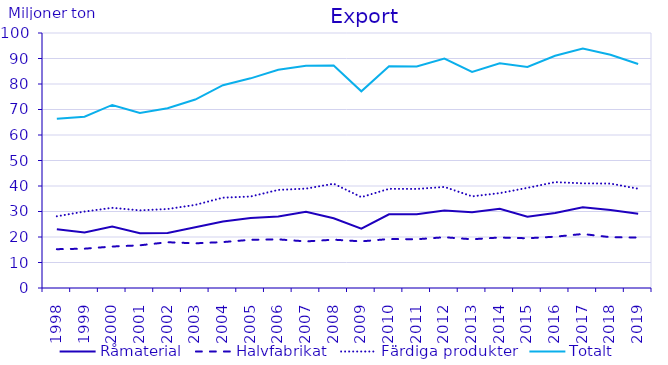
| Category | Råmaterial | Halvfabrikat | Färdiga produkter | Totalt |
|---|---|---|---|---|
| 1998.0 | 23.014 | 15.225 | 28.118 | 66.356 |
| 1999.0 | 21.768 | 15.418 | 29.983 | 67.169 |
| 2000.0 | 24.092 | 16.259 | 31.435 | 71.786 |
| 2001.0 | 21.458 | 16.744 | 30.44 | 68.642 |
| 2002.0 | 21.553 | 17.952 | 30.983 | 70.488 |
| 2003.0 | 23.794 | 17.523 | 32.59 | 73.906 |
| 2004.0 | 26.099 | 18.01 | 35.421 | 79.53 |
| 2005.0 | 27.44 | 18.905 | 35.877 | 82.222 |
| 2006.0 | 28.008 | 19.074 | 38.469 | 85.551 |
| 2007.0 | 29.901 | 18.267 | 38.976 | 87.144 |
| 2008.0 | 27.364 | 18.951 | 40.893 | 87.208 |
| 2009.0 | 23.233 | 18.287 | 35.626 | 77.145 |
| 2010.0 | 28.899 | 19.203 | 38.89 | 86.992 |
| 2011.0 | 28.913 | 19.112 | 38.848 | 86.873 |
| 2012.0 | 30.4 | 19.907 | 39.63 | 89.938 |
| 2013.0 | 29.709 | 19.106 | 35.945 | 84.76 |
| 2014.0 | 31.1 | 19.806 | 37.203 | 88.109 |
| 2015.0 | 27.91 | 19.502 | 39.273 | 86.686 |
| 2016.0 | 29.44 | 20.124 | 41.517 | 91.081 |
| 2017.0 | 31.692 | 21.176 | 41.047 | 93.916 |
| 2018.0 | 30.59 | 19.922 | 40.949 | 91.46 |
| 2019.0 | 29.098 | 19.797 | 38.933 | 87.828 |